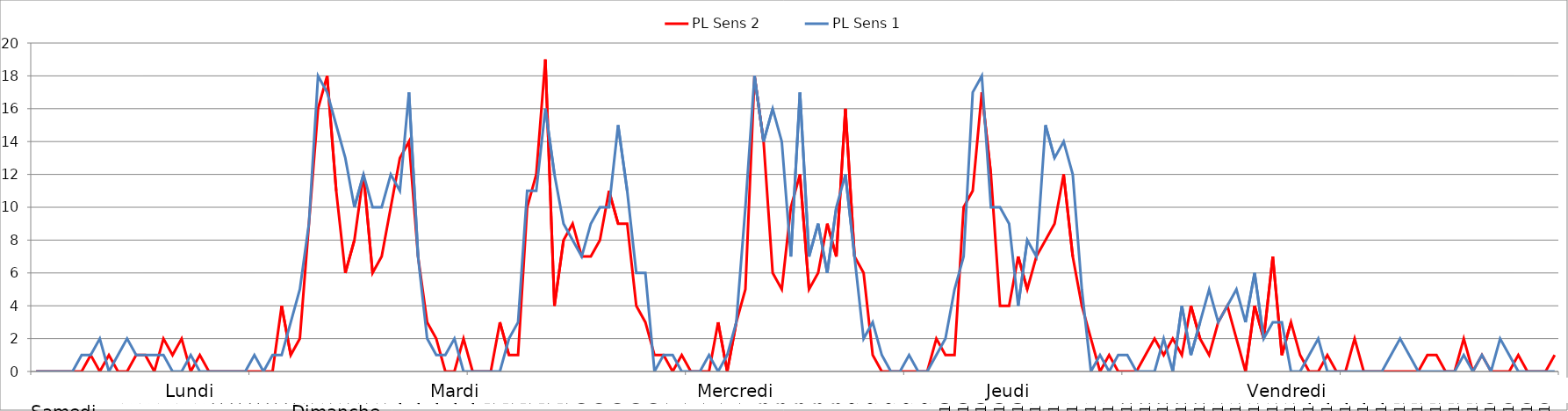
| Category | PL Sens 2 | PL Sens 1 |
|---|---|---|
| 0 | 0 | 0 |
| 1 | 0 | 0 |
| 2 | 0 | 0 |
| 3 | 0 | 0 |
| 4 | 0 | 0 |
| 5 | 0 | 1 |
| 6 | 1 | 1 |
| 7 | 0 | 2 |
| 8 | 1 | 0 |
| 9 | 0 | 1 |
| 10 | 0 | 2 |
| 11 | 1 | 1 |
| 12 | 1 | 1 |
| 13 | 0 | 1 |
| 14 | 2 | 1 |
| 15 | 1 | 0 |
| 16 | 2 | 0 |
| 17 | 0 | 1 |
| 18 | 1 | 0 |
| 19 | 0 | 0 |
| 20 | 0 | 0 |
| 21 | 0 | 0 |
| 22 | 0 | 0 |
| 23 | 0 | 0 |
| 24 | 0 | 1 |
| 25 | 0 | 0 |
| 26 | 0 | 1 |
| 27 | 4 | 1 |
| 28 | 1 | 3 |
| 29 | 2 | 5 |
| 30 | 9 | 9 |
| 31 | 16 | 18 |
| 32 | 18 | 17 |
| 33 | 11 | 15 |
| 34 | 6 | 13 |
| 35 | 8 | 10 |
| 36 | 12 | 12 |
| 37 | 6 | 10 |
| 38 | 7 | 10 |
| 39 | 10 | 12 |
| 40 | 13 | 11 |
| 41 | 14 | 17 |
| 42 | 7 | 7 |
| 43 | 3 | 2 |
| 44 | 2 | 1 |
| 45 | 0 | 1 |
| 46 | 0 | 2 |
| 47 | 2 | 0 |
| 48 | 0 | 0 |
| 49 | 0 | 0 |
| 50 | 0 | 0 |
| 51 | 3 | 0 |
| 52 | 1 | 2 |
| 53 | 1 | 3 |
| 54 | 10 | 11 |
| 55 | 12 | 11 |
| 56 | 19 | 16 |
| 57 | 4 | 12 |
| 58 | 8 | 9 |
| 59 | 9 | 8 |
| 60 | 7 | 7 |
| 61 | 7 | 9 |
| 62 | 8 | 10 |
| 63 | 11 | 10 |
| 64 | 9 | 15 |
| 65 | 9 | 11 |
| 66 | 4 | 6 |
| 67 | 3 | 6 |
| 68 | 1 | 0 |
| 69 | 1 | 1 |
| 70 | 0 | 1 |
| 71 | 1 | 0 |
| 72 | 0 | 0 |
| 73 | 0 | 0 |
| 74 | 0 | 1 |
| 75 | 3 | 0 |
| 76 | 0 | 1 |
| 77 | 3 | 3 |
| 78 | 5 | 10 |
| 79 | 18 | 18 |
| 80 | 14 | 14 |
| 81 | 6 | 16 |
| 82 | 5 | 14 |
| 83 | 10 | 7 |
| 84 | 12 | 17 |
| 85 | 5 | 7 |
| 86 | 6 | 9 |
| 87 | 9 | 6 |
| 88 | 7 | 10 |
| 89 | 16 | 12 |
| 90 | 7 | 7 |
| 91 | 6 | 2 |
| 92 | 1 | 3 |
| 93 | 0 | 1 |
| 94 | 0 | 0 |
| 95 | 0 | 0 |
| 96 | 0 | 1 |
| 97 | 0 | 0 |
| 98 | 0 | 0 |
| 99 | 2 | 1 |
| 100 | 1 | 2 |
| 101 | 1 | 5 |
| 102 | 10 | 7 |
| 103 | 11 | 17 |
| 104 | 17 | 18 |
| 105 | 12 | 10 |
| 106 | 4 | 10 |
| 107 | 4 | 9 |
| 108 | 7 | 4 |
| 109 | 5 | 8 |
| 110 | 7 | 7 |
| 111 | 8 | 15 |
| 112 | 9 | 13 |
| 113 | 12 | 14 |
| 114 | 7 | 12 |
| 115 | 4 | 5 |
| 116 | 2 | 0 |
| 117 | 0 | 1 |
| 118 | 1 | 0 |
| 119 | 0 | 1 |
| 120 | 0 | 1 |
| 121 | 0 | 0 |
| 122 | 1 | 0 |
| 123 | 2 | 0 |
| 124 | 1 | 2 |
| 125 | 2 | 0 |
| 126 | 1 | 4 |
| 127 | 4 | 1 |
| 128 | 2 | 3 |
| 129 | 1 | 5 |
| 130 | 3 | 3 |
| 131 | 4 | 4 |
| 132 | 2 | 5 |
| 133 | 0 | 3 |
| 134 | 4 | 6 |
| 135 | 2 | 2 |
| 136 | 7 | 3 |
| 137 | 1 | 3 |
| 138 | 3 | 0 |
| 139 | 1 | 0 |
| 140 | 0 | 1 |
| 141 | 0 | 2 |
| 142 | 1 | 0 |
| 143 | 0 | 0 |
| 144 | 0 | 0 |
| 145 | 2 | 0 |
| 146 | 0 | 0 |
| 147 | 0 | 0 |
| 148 | 0 | 0 |
| 149 | 0 | 1 |
| 150 | 0 | 2 |
| 151 | 0 | 1 |
| 152 | 0 | 0 |
| 153 | 1 | 0 |
| 154 | 1 | 0 |
| 155 | 0 | 0 |
| 156 | 0 | 0 |
| 157 | 2 | 1 |
| 158 | 0 | 0 |
| 159 | 1 | 1 |
| 160 | 0 | 0 |
| 161 | 0 | 2 |
| 162 | 0 | 1 |
| 163 | 1 | 0 |
| 164 | 0 | 0 |
| 165 | 0 | 0 |
| 166 | 0 | 0 |
| 167 | 1 | 0 |